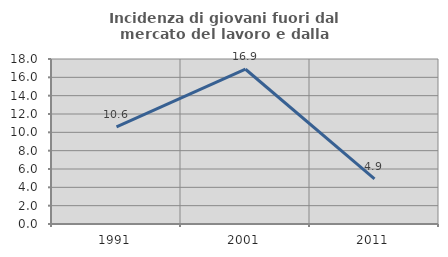
| Category | Incidenza di giovani fuori dal mercato del lavoro e dalla formazione  |
|---|---|
| 1991.0 | 10.588 |
| 2001.0 | 16.883 |
| 2011.0 | 4.918 |